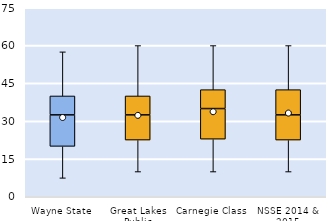
| Category | 25th | 50th | 75th |
|---|---|---|---|
| Wayne State | 20 | 12.5 | 7.5 |
| Great Lakes Public | 22.5 | 10 | 7.5 |
| Carnegie Class | 22.857 | 12.143 | 7.5 |
| NSSE 2014 & 2015 | 22.5 | 10 | 10 |